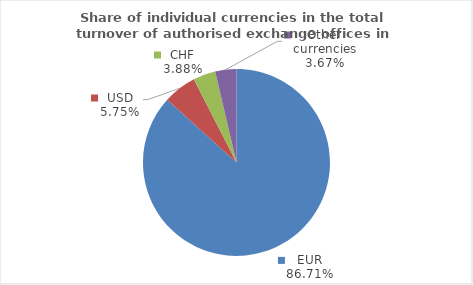
| Category | Series 0 |
|---|---|
| EUR | 86.71 |
| USD | 5.749 |
| CHF | 3.872 |
| Other currencies | 3.669 |